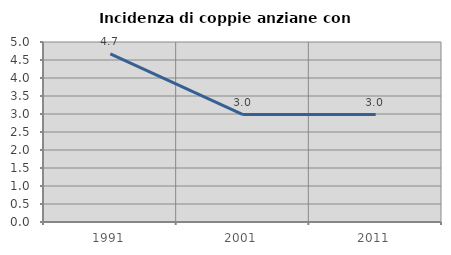
| Category | Incidenza di coppie anziane con figli |
|---|---|
| 1991.0 | 4.673 |
| 2001.0 | 2.985 |
| 2011.0 | 2.985 |